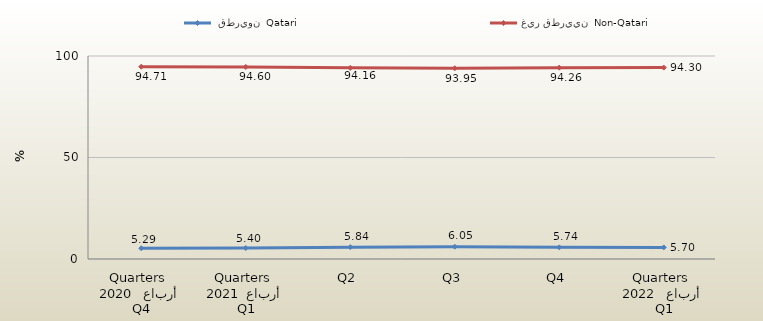
| Category |  قطريون  Qatari | غير قطريين  Non-Qatari |
|---|---|---|
| 0 | 5.293 | 94.707 |
| 1 | 5.404 | 94.596 |
| 2 | 5.836 | 94.164 |
| 3 | 6.047 | 93.953 |
| 4 | 5.737 | 94.263 |
| 5 | 5.7 | 94.3 |